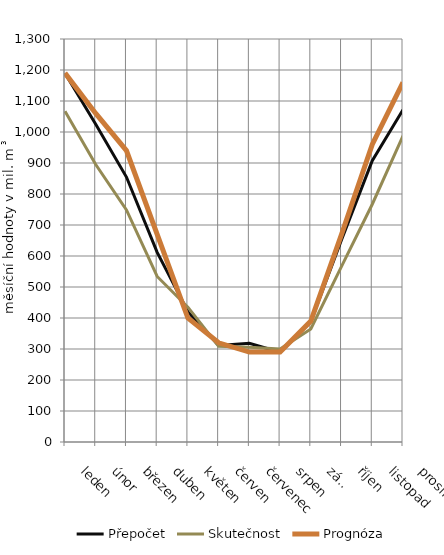
| Category | Přepočet | Skutečnost | Prognóza |
|---|---|---|---|
| leden | 1189.215 | 1067.219 | 1190 |
| únor | 1025.129 | 895.142 | 1060 |
| březen | 854.699 | 748.453 | 940 |
| duben | 611.714 | 533.988 | 670 |
| květen | 420.326 | 434.924 | 400 |
| červen | 311.589 | 308.896 | 320 |
| červenec | 318.312 | 305.463 | 290 |
| srpen | 289.569 | 300.029 | 290 |
| září | 388.43 | 364.762 | 390 |
| říjen | 652.758 | 566.629 | 670 |
| listopad | 907.252 | 766.971 | 960 |
| prosinec | 1071.656 | 987.852 | 1160 |